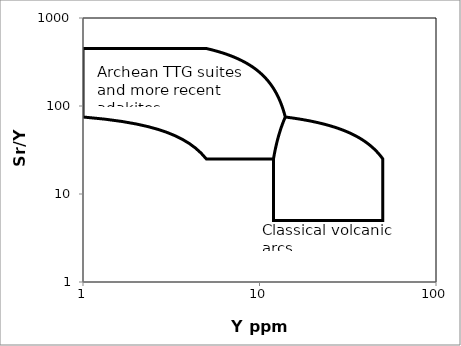
| Category | Series 0 |
|---|---|
| 12.0 | 25 |
| 12.0 | 5 |
| 50.0 | 5 |
| 50.0 | 25 |
| 49.28 | 26 |
| 48.56 | 27 |
| 47.84 | 28 |
| 47.120000000000005 | 29 |
| 46.400000000000006 | 30 |
| 45.68000000000001 | 31 |
| 44.96000000000001 | 32 |
| 44.24000000000001 | 33 |
| 43.52000000000001 | 34 |
| 42.80000000000001 | 35 |
| 42.08000000000001 | 36 |
| 41.360000000000014 | 37 |
| 40.640000000000015 | 38 |
| 39.920000000000016 | 39 |
| 39.20000000000002 | 40 |
| 38.48000000000002 | 41 |
| 37.76000000000002 | 42 |
| 37.04000000000002 | 43 |
| 36.32000000000002 | 44 |
| 35.60000000000002 | 45 |
| 34.880000000000024 | 46 |
| 34.160000000000025 | 47 |
| 33.440000000000026 | 48 |
| 32.72000000000003 | 49 |
| 32.00000000000003 | 50 |
| 31.28000000000003 | 51 |
| 30.56000000000003 | 52 |
| 29.840000000000032 | 53 |
| 29.120000000000033 | 54 |
| 28.400000000000034 | 55 |
| 27.680000000000035 | 56 |
| 26.960000000000036 | 57 |
| 26.240000000000038 | 58 |
| 25.52000000000004 | 59 |
| 24.80000000000004 | 60 |
| 24.08000000000004 | 61 |
| 23.360000000000042 | 62 |
| 22.640000000000043 | 63 |
| 21.920000000000044 | 64 |
| 21.200000000000045 | 65 |
| 20.480000000000047 | 66 |
| 19.760000000000048 | 67 |
| 19.04000000000005 | 68 |
| 18.32000000000005 | 69 |
| 17.60000000000005 | 70 |
| 16.880000000000052 | 71 |
| 16.160000000000053 | 72 |
| 15.440000000000053 | 73 |
| 14.720000000000052 | 74 |
| 14.0 | 75 |
| 13.82 | 82.5 |
| 13.64 | 90 |
| 13.46 | 97.5 |
| 13.280000000000001 | 105 |
| 13.100000000000001 | 112.5 |
| 12.920000000000002 | 120 |
| 12.740000000000002 | 127.5 |
| 12.560000000000002 | 135 |
| 12.380000000000003 | 142.5 |
| 12.200000000000003 | 150 |
| 12.020000000000003 | 157.5 |
| 11.840000000000003 | 165 |
| 11.660000000000004 | 172.5 |
| 11.480000000000004 | 180 |
| 11.300000000000004 | 187.5 |
| 11.120000000000005 | 195 |
| 10.940000000000005 | 202.5 |
| 10.760000000000005 | 210 |
| 10.580000000000005 | 217.5 |
| 10.400000000000006 | 225 |
| 10.220000000000006 | 232.5 |
| 10.040000000000006 | 240 |
| 9.860000000000007 | 247.5 |
| 9.680000000000007 | 255 |
| 9.500000000000007 | 262.5 |
| 9.320000000000007 | 270 |
| 9.140000000000008 | 277.5 |
| 8.960000000000008 | 285 |
| 8.780000000000008 | 292.5 |
| 8.600000000000009 | 300 |
| 8.420000000000009 | 307.5 |
| 8.240000000000009 | 315 |
| 8.06000000000001 | 322.5 |
| 7.88000000000001 | 330 |
| 7.70000000000001 | 337.5 |
| 7.52000000000001 | 345 |
| 7.3400000000000105 | 352.5 |
| 7.160000000000011 | 360 |
| 6.980000000000011 | 367.5 |
| 6.800000000000011 | 375 |
| 6.620000000000012 | 382.5 |
| 6.440000000000012 | 390 |
| 6.260000000000012 | 397.5 |
| 6.0800000000000125 | 405 |
| 5.900000000000013 | 412.5 |
| 5.720000000000013 | 420 |
| 5.540000000000013 | 427.5 |
| 5.360000000000014 | 435 |
| 5.180000000000014 | 442.5 |
| 5.0 | 450 |
| 1.0 | 450 |
| 1.0 | 75 |
| 1.3333333333333333 | 70.833 |
| 1.6666666666666665 | 66.667 |
| 1.9999999999999998 | 62.5 |
| 2.333333333333333 | 58.333 |
| 2.6666666666666665 | 54.167 |
| 3.0 | 50 |
| 3.3333333333333335 | 45.833 |
| 3.666666666666667 | 41.667 |
| 4.0 | 37.5 |
| 4.333333333333333 | 33.333 |
| 4.666666666666666 | 29.167 |
| 5.0 | 25 |
| 12.0 | 25 |
| 12.166666666666666 | 29.167 |
| 12.333333333333332 | 33.333 |
| 12.499999999999998 | 37.5 |
| 12.666666666666664 | 41.667 |
| 12.83333333333333 | 45.833 |
| 12.999999999999996 | 50 |
| 13.166666666666663 | 54.167 |
| 13.333333333333329 | 58.333 |
| 13.499999999999995 | 62.5 |
| 13.66666666666666 | 66.667 |
| 13.833333333333327 | 70.833 |
| 14.0 | 75 |